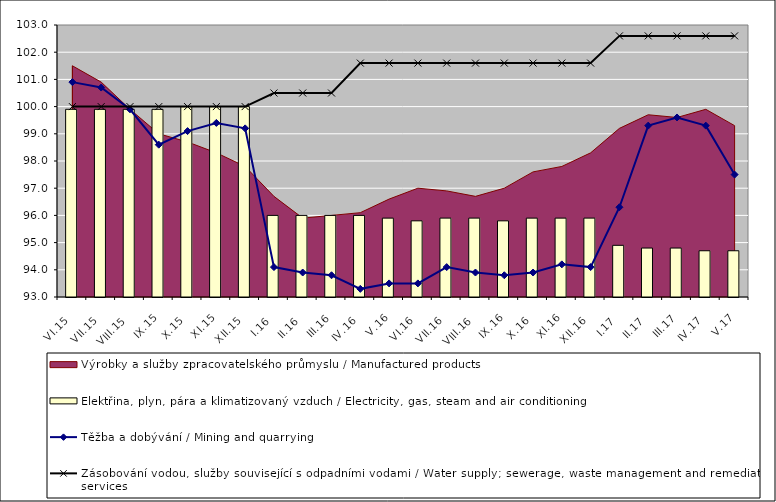
| Category | Elektřina, plyn, pára a klimatizovaný vzduch / Electricity, gas, steam and air conditioning |
|---|---|
| VI.15 | 99.9 |
| VII.15 | 99.9 |
| VIII.15 | 99.9 |
| IX.15 | 99.9 |
| X.15 | 100 |
| XI.15 | 100 |
| XII.15 | 100 |
| I.16 | 96 |
| II.16 | 96 |
| III.16 | 96 |
| IV.16 | 96 |
| V.16 | 95.9 |
| VI.16 | 95.8 |
| VII.16 | 95.9 |
| VIII.16 | 95.9 |
| IX.16 | 95.8 |
| X.16 | 95.9 |
| XI.16 | 95.9 |
| XII.16 | 95.9 |
| I.17 | 94.9 |
| II.17 | 94.8 |
| III.17 | 94.8 |
| IV.17 | 94.7 |
| V.17 | 94.7 |